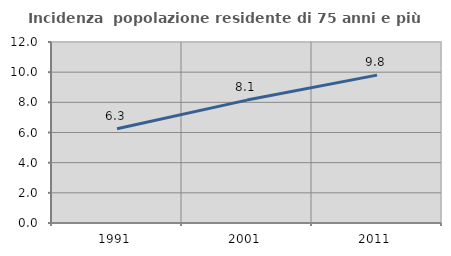
| Category | Incidenza  popolazione residente di 75 anni e più |
|---|---|
| 1991.0 | 6.253 |
| 2001.0 | 8.148 |
| 2011.0 | 9.802 |